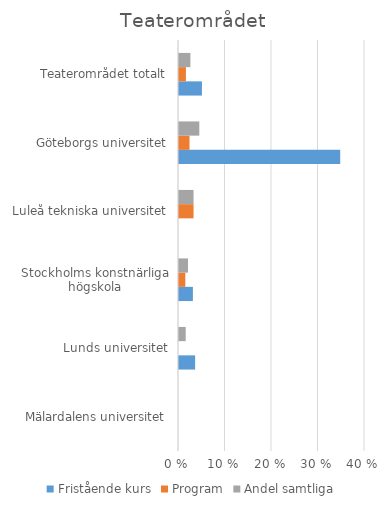
| Category | Fristående kurs | Program | Andel samtliga |
|---|---|---|---|
| Mälardalens universitet | 0 | 0 | 0 |
| Lunds universitet | 0.035 | 0 | 0.014 |
| Stockholms konstnärliga högskola | 0.03 | 0.014 | 0.019 |
| Luleå tekniska universitet | 0 | 0.031 | 0.031 |
| Göteborgs universitet | 0.347 | 0.023 | 0.044 |
| Teaterområdet totalt | 0.049 | 0.015 | 0.024 |